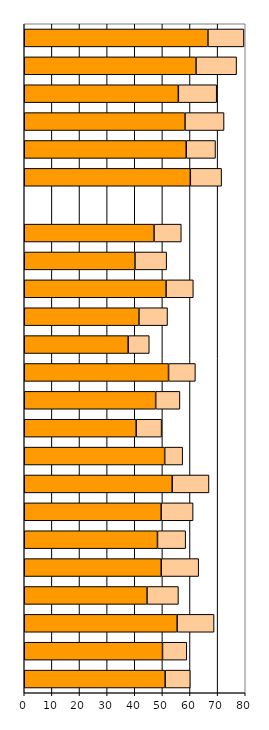
| Category | Series 0 | Series 1 |
|---|---|---|
| 0 | 51.005 | 9.096 |
| 1 | 50.043 | 8.802 |
| 2 | 55.334 | 13.381 |
| 3 | 44.44 | 11.371 |
| 4 | 49.598 | 13.543 |
| 5 | 48.224 | 10.208 |
| 6 | 49.557 | 11.567 |
| 7 | 53.549 | 13.319 |
| 8 | 50.834 | 6.509 |
| 9 | 40.51 | 9.207 |
| 10 | 47.577 | 8.77 |
| 11 | 52.238 | 9.709 |
| 12 | 37.609 | 7.651 |
| 13 | 41.511 | 10.354 |
| 14 | 51.331 | 9.868 |
| 15 | 40.068 | 11.481 |
| 16 | 46.978 | 9.869 |
| 17 | 0 | 0 |
| 18 | 60.117 | 11.316 |
| 19 | 58.63 | 10.603 |
| 20 | 58.187 | 14.139 |
| 21 | 55.785 | 13.878 |
| 22 | 62.18 | 14.686 |
| 23 | 66.486 | 13.04 |